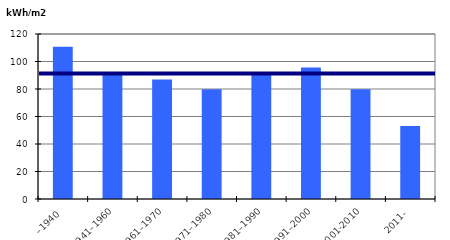
| Category | Byggårskategori |
|---|---|
| –1940 | 110.718 |
| 1941–1960 | 91.513 |
| 1961–1970 | 86.836 |
| 1971–1980 | 79.889 |
| 1981–1990 | 91.982 |
| 1991–2000 | 95.593 |
| 2001-2010 | 79.828 |
| 2011- | 53.013 |